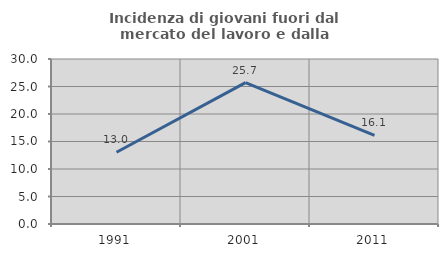
| Category | Incidenza di giovani fuori dal mercato del lavoro e dalla formazione  |
|---|---|
| 1991.0 | 13.043 |
| 2001.0 | 25.71 |
| 2011.0 | 16.117 |